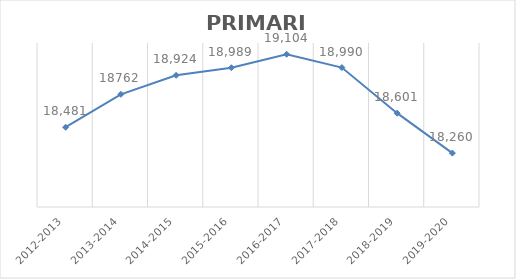
| Category | PRIMARIA |
|---|---|
| 2012-2013 | 18481 |
| 2013-2014 | 18762 |
| 2014-2015 | 18924 |
| 2015-2016 | 18989 |
| 2016-2017 | 19104 |
| 2017-2018 | 18990 |
| 2018-2019 | 18601 |
| 2019-2020 | 18260 |